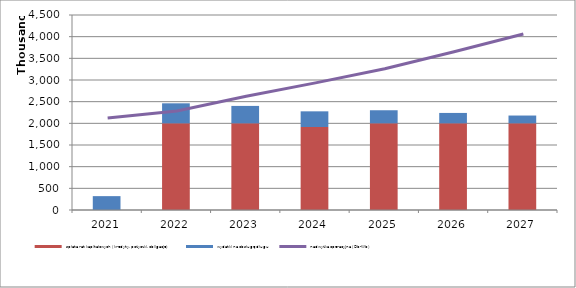
| Category | spłata rat kapitałowych (kredyty, pożyczki, obligacje) | wydatki na obsługę długu |
|---|---|---|
| 2021.0 | 0 | 320000 |
| 2022.0 | 2000000 | 462000 |
| 2023.0 | 2000000 | 402000 |
| 2024.0 | 1915000 | 362000 |
| 2025.0 | 2000000 | 302000 |
| 2026.0 | 2000000 | 240000 |
| 2027.0 | 2000000 | 180000 |